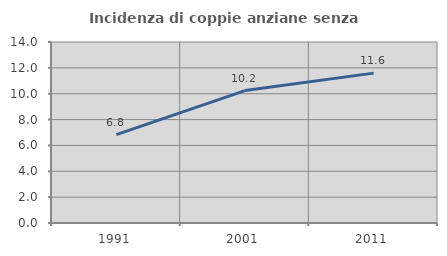
| Category | Incidenza di coppie anziane senza figli  |
|---|---|
| 1991.0 | 6.833 |
| 2001.0 | 10.245 |
| 2011.0 | 11.594 |